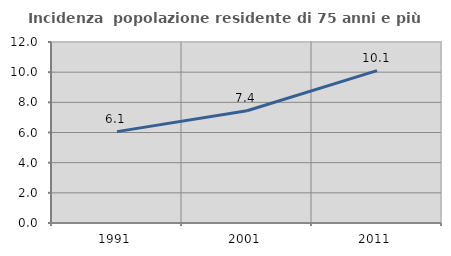
| Category | Incidenza  popolazione residente di 75 anni e più |
|---|---|
| 1991.0 | 6.058 |
| 2001.0 | 7.442 |
| 2011.0 | 10.102 |